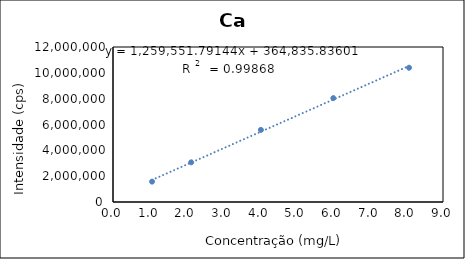
| Category | Series 0 |
|---|---|
| 1.0653570491691282 | 1576312 |
| 2.132189019099549 | 3072192 |
| 4.033046530024203 | 5582842 |
| 6.009124746576272 | 8043222 |
| 8.074079358308165 | 10395442 |